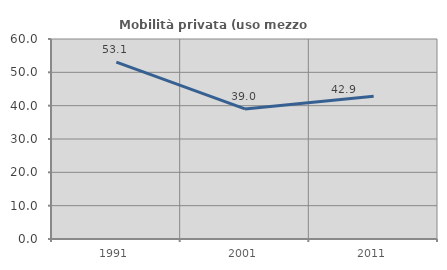
| Category | Mobilità privata (uso mezzo privato) |
|---|---|
| 1991.0 | 53.061 |
| 2001.0 | 39.024 |
| 2011.0 | 42.857 |